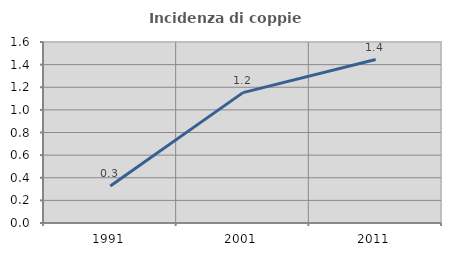
| Category | Incidenza di coppie miste |
|---|---|
| 1991.0 | 0.327 |
| 2001.0 | 1.152 |
| 2011.0 | 1.445 |